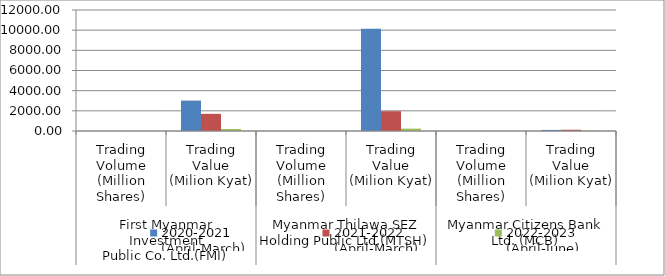
| Category | 2020-2021
(April-March) | 2021-2022
(April-March) | 2022-2023
(April-June) |
|---|---|---|---|
| 0 | 0.299 | 0.195 | 0.025 |
| 1 | 3015.242 | 1701.689 | 193.558 |
| 2 | 2.786 | 0.619 | 0.088 |
| 3 | 10135.247 | 1963.055 | 233.778 |
| 4 | 0.013 | 0.016 | 0.002 |
| 5 | 105.513 | 123.623 | 15.02 |